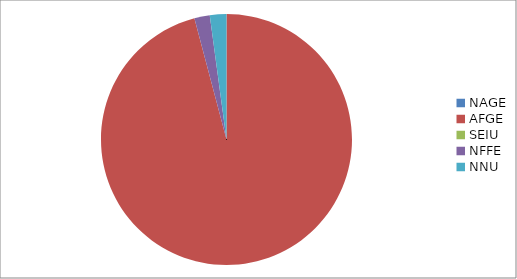
| Category | Series 0 |
|---|---|
| NAGE | 0 |
| AFGE | 11595 |
| SEIU | 0 |
| NFFE | 240 |
| NNU | 258 |